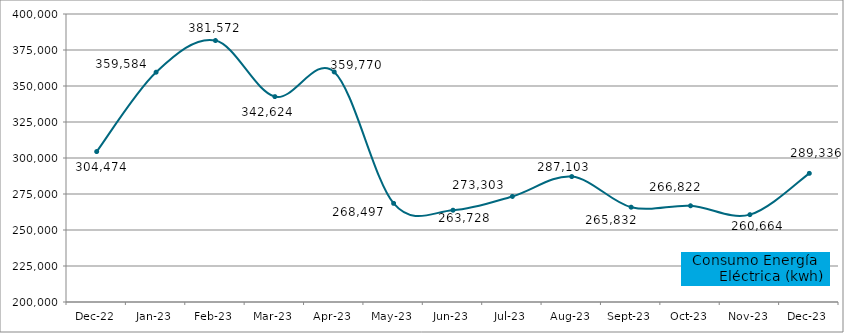
| Category | dic-22 |
|---|---|
| 2022-12-01 | 304474.012 |
| 2023-01-01 | 359583.787 |
| 2023-02-01 | 381572.471 |
| 2023-03-01 | 342623.674 |
| 2023-04-01 | 359770.072 |
| 2023-05-01 | 268496.726 |
| 2023-06-01 | 263727.965 |
| 2023-07-01 | 273303.375 |
| 2023-08-01 | 287103.118 |
| 2023-09-01 | 265832.469 |
| 2023-10-01 | 266821.706 |
| 2023-11-01 | 260663.832 |
| 2023-12-01 | 289336.014 |